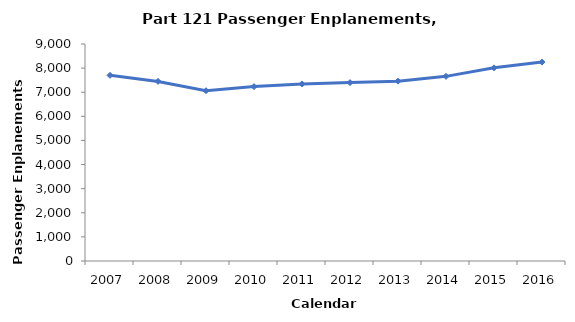
| Category | Passengers (100,000s) |
|---|---|
| 2007.0 | 7702.619 |
| 2008.0 | 7448.246 |
| 2009.0 | 7061.064 |
| 2010.0 | 7232.912 |
| 2011.0 | 7341.547 |
| 2012.0 | 7399.775 |
| 2013.0 | 7459.964 |
| 2014.0 | 7658.059 |
| 2015.0 | 8010.574 |
| 2016.0 | 8250.113 |